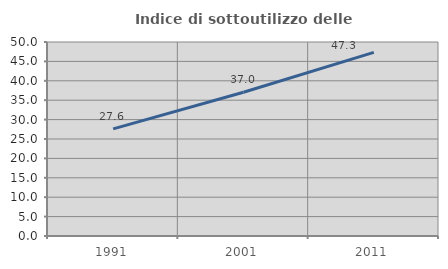
| Category | Indice di sottoutilizzo delle abitazioni  |
|---|---|
| 1991.0 | 27.62 |
| 2001.0 | 37.048 |
| 2011.0 | 47.334 |